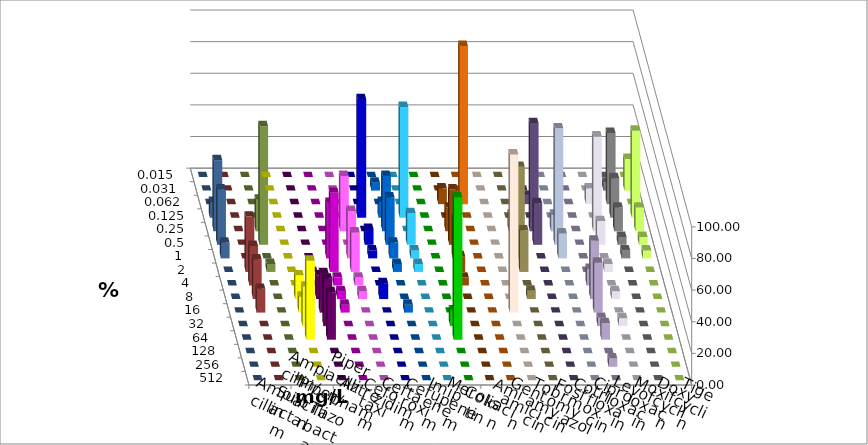
| Category | Ampicillin | Ampicillin/ Sulbactam | Piperacillin | Piperacillin/ Tazobactam | Aztreonam | Cefotaxim | Ceftazidim | Cefuroxim | Imipenem | Meropenem | Colistin | Amikacin | Gentamicin | Tobramycin | Fosfomycin | Cotrimoxazol | Ciprofloxacin | Levofloxacin | Moxifloxacin | Doxycyclin | Tigecyclin |
|---|---|---|---|---|---|---|---|---|---|---|---|---|---|---|---|---|---|---|---|---|---|
| 0.015 | 0 | 0 | 0 | 0 | 0 | 0 | 0 | 0 | 0 | 0 | 0 | 0 | 0 | 0 | 0 | 0 | 0 | 0 | 0 | 0 | 0 |
| 0.031 | 0 | 0 | 0 | 0 | 0 | 5 | 0 | 0 | 0 | 0 | 0 | 0 | 0 | 0 | 0 | 0 | 5 | 20 | 0 | 0 | 0 |
| 0.062 | 0 | 0 | 0 | 0 | 0 | 0 | 0 | 0 | 10 | 100 | 0 | 0 | 5.263 | 0 | 0 | 10 | 45 | 0 | 0 | 0 | 0 |
| 0.125 | 0 | 0 | 0 | 0 | 75 | 10 | 70 | 0 | 0 | 0 | 0 | 0 | 0 | 0 | 0 | 0 | 25 | 55 | 10 | 0 | 0 |
| 0.25 | 0 | 0 | 0 | 35 | 0 | 35 | 0 | 0 | 15 | 0 | 0 | 10.526 | 68.421 | 10.526 | 0 | 60 | 15 | 15 | 45 | 0 | 20 |
| 0.5 | 0 | 0 | 0 | 0 | 10 | 30 | 20 | 0 | 35 | 0 | 0 | 0 | 26.316 | 73.684 | 0 | 15 | 5 | 5 | 35 | 0 | 75 |
| 1.0 | 0 | 0 | 35 | 30 | 5 | 10 | 5 | 0 | 25 | 0 | 0 | 57.895 | 0 | 15.789 | 0 | 0 | 5 | 5 | 10 | 0 | 0 |
| 2.0 | 0 | 0 | 50 | 25 | 0 | 5 | 5 | 0 | 10 | 0 | 0 | 26.316 | 0 | 0 | 0 | 5 | 0 | 0 | 0 | 35 | 5 |
| 4.0 | 0 | 0 | 5 | 5 | 0 | 0 | 0 | 0 | 5 | 0 | 0 | 0 | 0 | 0 | 10.526 | 0 | 0 | 0 | 0 | 25 | 0 |
| 8.0 | 15 | 15 | 5 | 5 | 10 | 0 | 0 | 0 | 0 | 0 | 0 | 5.263 | 0 | 0 | 36.842 | 5 | 0 | 0 | 0 | 25 | 0 |
| 16.0 | 10 | 25 | 5 | 0 | 0 | 5 | 0 | 0 | 0 | 0 | 100 | 0 | 0 | 0 | 31.579 | 0 | 0 | 0 | 0 | 15 | 0 |
| 32.0 | 25 | 30 | 0 | 0 | 0 | 0 | 0 | 10 | 0 | 0 | 0 | 0 | 0 | 0 | 5.263 | 5 | 0 | 0 | 0 | 0 | 0 |
| 64.0 | 50 | 30 | 0 | 0 | 0 | 0 | 0 | 90 | 0 | 0 | 0 | 0 | 0 | 0 | 10.526 | 0 | 0 | 0 | 0 | 0 | 0 |
| 128.0 | 0 | 0 | 0 | 0 | 0 | 0 | 0 | 0 | 0 | 0 | 0 | 0 | 0 | 0 | 0 | 0 | 0 | 0 | 0 | 0 | 0 |
| 256.0 | 0 | 0 | 0 | 0 | 0 | 0 | 0 | 0 | 0 | 0 | 0 | 0 | 0 | 0 | 5.263 | 0 | 0 | 0 | 0 | 0 | 0 |
| 512.0 | 0 | 0 | 0 | 0 | 0 | 0 | 0 | 0 | 0 | 0 | 0 | 0 | 0 | 0 | 0 | 0 | 0 | 0 | 0 | 0 | 0 |